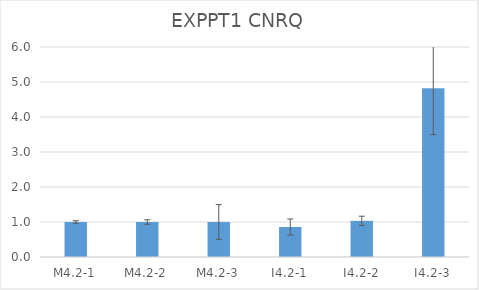
| Category | EXPPT1 CNRQ |
|---|---|
| M4.2-1 | 1 |
| M4.2-2 | 1 |
| M4.2-3 | 1 |
| I4.2-1 | 0.858 |
| I4.2-2 | 1.034 |
| I4.2-3 | 4.824 |